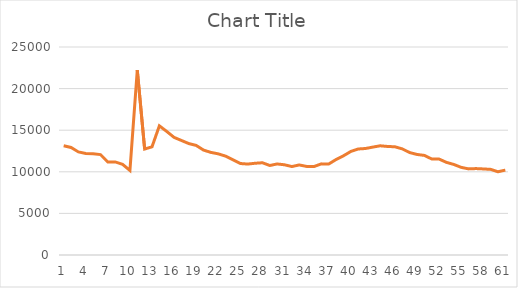
| Category | Series 1 |
|---|---|
| 0 | 13126.3 |
| 1 | 12922.2 |
| 2 | 12389.6 |
| 3 | 12201.6 |
| 4 | 12178.2 |
| 5 | 12072.2 |
| 6 | 11174.6 |
| 7 | 11190.7 |
| 8 | 10887.7 |
| 9 | 10160.5 |
| 10 | 22232.2 |
| 11 | 12736.2 |
| 12 | 13003.7 |
| 13 | 15524.8 |
| 14 | 14850.8 |
| 15 | 14135 |
| 16 | 13763.5 |
| 17 | 13393.5 |
| 18 | 13171.5 |
| 19 | 12609.8 |
| 20 | 12331.7 |
| 21 | 12157.1 |
| 22 | 11879.3 |
| 23 | 11443.9 |
| 24 | 10997.1 |
| 25 | 10929.4 |
| 26 | 11026 |
| 27 | 11087.6 |
| 28 | 10759 |
| 29 | 10940.4 |
| 30 | 10843.6 |
| 31 | 10631 |
| 32 | 10824.4 |
| 33 | 10649 |
| 34 | 10629.5 |
| 35 | 10953 |
| 36 | 10933.2 |
| 37 | 11470.8 |
| 38 | 11917.3 |
| 39 | 12439.6 |
| 40 | 12741.4 |
| 41 | 12799.8 |
| 42 | 12968.2 |
| 43 | 13126.8 |
| 44 | 13044.5 |
| 45 | 13008.4 |
| 46 | 12754 |
| 47 | 12313.6 |
| 48 | 12084.7 |
| 49 | 11970.6 |
| 50 | 11543.2 |
| 51 | 11531.5 |
| 52 | 11133.8 |
| 53 | 10884 |
| 54 | 10534.9 |
| 55 | 10350.6 |
| 56 | 10387.2 |
| 57 | 10346.1 |
| 58 | 10293 |
| 59 | 10006.9 |
| 60 | 10202.7 |